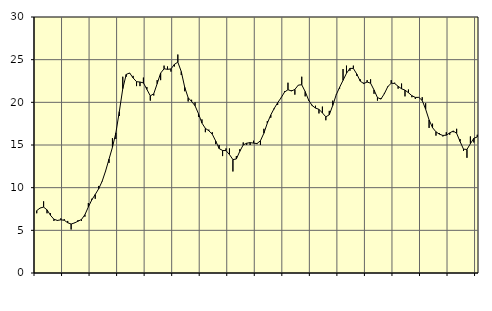
| Category | Piggar | Series 1 |
|---|---|---|
| nan | 7 | 7.31 |
| 87.0 | 7.6 | 7.62 |
| 87.0 | 8.4 | 7.72 |
| 87.0 | 7 | 7.4 |
| nan | 7 | 6.76 |
| 88.0 | 6.1 | 6.3 |
| 88.0 | 6.1 | 6.16 |
| 88.0 | 6.4 | 6.23 |
| nan | 6.3 | 6.18 |
| 89.0 | 6.1 | 5.89 |
| 89.0 | 5.1 | 5.74 |
| 89.0 | 5.9 | 5.87 |
| nan | 6.2 | 6.07 |
| 90.0 | 6.1 | 6.27 |
| 90.0 | 6.6 | 6.83 |
| 90.0 | 8.2 | 7.74 |
| nan | 8.7 | 8.57 |
| 91.0 | 8.7 | 9.2 |
| 91.0 | 10.2 | 9.87 |
| 91.0 | 10.7 | 10.74 |
| nan | 11.9 | 11.94 |
| 92.0 | 12.9 | 13.34 |
| 92.0 | 15.8 | 14.73 |
| 92.0 | 15.7 | 16.43 |
| nan | 18.4 | 18.92 |
| 93.0 | 23 | 21.6 |
| 93.0 | 23 | 23.27 |
| 93.0 | 23.4 | 23.44 |
| nan | 23.1 | 22.86 |
| 94.0 | 21.9 | 22.42 |
| 94.0 | 21.9 | 22.38 |
| 94.0 | 22.9 | 22.28 |
| nan | 21.8 | 21.52 |
| 95.0 | 20.2 | 20.76 |
| 95.0 | 20.8 | 21 |
| 95.0 | 22.6 | 22.19 |
| nan | 22.6 | 23.43 |
| 96.0 | 24.3 | 23.93 |
| 96.0 | 24.2 | 23.87 |
| 96.0 | 23.6 | 23.91 |
| nan | 24.2 | 24.45 |
| 97.0 | 25.6 | 24.71 |
| 97.0 | 23.2 | 23.6 |
| 97.0 | 21.3 | 21.76 |
| nan | 20.1 | 20.54 |
| 98.0 | 20.3 | 20.1 |
| 98.0 | 20 | 19.6 |
| 98.0 | 18.3 | 18.67 |
| nan | 18 | 17.57 |
| 99.0 | 16.5 | 16.95 |
| 99.0 | 16.8 | 16.67 |
| 99.0 | 16.5 | 16.27 |
| nan | 15.1 | 15.47 |
| 0.0 | 15 | 14.58 |
| 0.0 | 13.7 | 14.36 |
| 0.0 | 14.6 | 14.34 |
| nan | 14.6 | 13.88 |
| 1.0 | 11.9 | 13.29 |
| 1.0 | 13.7 | 13.36 |
| 1.0 | 14.5 | 14.26 |
| nan | 15.3 | 15.01 |
| 2.0 | 15 | 15.21 |
| 2.0 | 15 | 15.28 |
| 2.0 | 15.5 | 15.22 |
| nan | 15.1 | 15.17 |
| 3.0 | 15 | 15.5 |
| 3.0 | 16.9 | 16.38 |
| 3.0 | 17.8 | 17.56 |
| nan | 18.2 | 18.52 |
| 4.0 | 19.2 | 19.29 |
| 4.0 | 19.7 | 19.95 |
| 4.0 | 20.5 | 20.53 |
| nan | 21.3 | 21.2 |
| 5.0 | 22.3 | 21.48 |
| 5.0 | 21.4 | 21.33 |
| 5.0 | 20.9 | 21.51 |
| nan | 22 | 22.02 |
| 6.0 | 23 | 22.06 |
| 6.0 | 20.7 | 21.26 |
| 6.0 | 20.2 | 20.26 |
| nan | 19.7 | 19.63 |
| 7.0 | 19.6 | 19.33 |
| 7.0 | 18.7 | 19.18 |
| 7.0 | 19.5 | 18.76 |
| nan | 17.9 | 18.3 |
| 8.0 | 19 | 18.54 |
| 8.0 | 20.2 | 19.63 |
| 8.0 | 20.9 | 20.87 |
| nan | 21.6 | 21.76 |
| 9.0 | 23.9 | 22.58 |
| 9.0 | 24.3 | 23.4 |
| 9.0 | 23.7 | 23.98 |
| nan | 24.3 | 23.97 |
| 10.0 | 23.1 | 23.31 |
| 10.0 | 22.7 | 22.48 |
| 10.0 | 22.3 | 22.2 |
| nan | 22.6 | 22.38 |
| 11.0 | 22.7 | 22.24 |
| 11.0 | 21 | 21.45 |
| 11.0 | 20.2 | 20.56 |
| nan | 20.5 | 20.38 |
| 12.0 | 21.1 | 21.01 |
| 12.0 | 21.9 | 21.84 |
| 12.0 | 22.6 | 22.24 |
| nan | 22.3 | 22.21 |
| 13.0 | 21.6 | 21.88 |
| 13.0 | 22.2 | 21.59 |
| 13.0 | 20.7 | 21.43 |
| nan | 21.5 | 21.13 |
| 14.0 | 20.6 | 20.78 |
| 14.0 | 20.4 | 20.58 |
| 14.0 | 20.6 | 20.58 |
| nan | 20.6 | 20.22 |
| 15.0 | 19.9 | 19.19 |
| 15.0 | 17 | 17.94 |
| 15.0 | 17.5 | 17.03 |
| nan | 16.1 | 16.54 |
| 16.0 | 16.4 | 16.27 |
| 16.0 | 16 | 16.12 |
| 16.0 | 16.5 | 16.15 |
| nan | 16.2 | 16.42 |
| 17.0 | 16.5 | 16.64 |
| 17.0 | 16.9 | 16.37 |
| 17.0 | 15.7 | 15.41 |
| nan | 14.3 | 14.51 |
| 18.0 | 13.5 | 14.48 |
| 18.0 | 16 | 15.15 |
| 18.0 | 15.3 | 15.79 |
| nan | 16.2 | 15.94 |